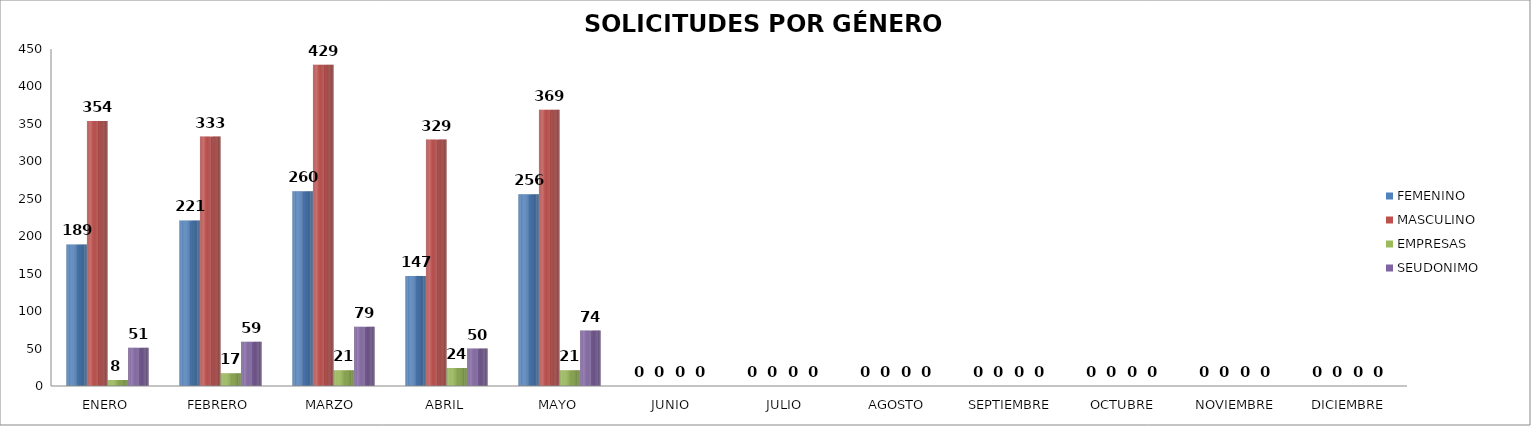
| Category | FEMENINO | MASCULINO | EMPRESAS | SEUDONIMO |
|---|---|---|---|---|
| ENERO | 189 | 354 | 8 | 51 |
| FEBRERO | 221 | 333 | 17 | 59 |
| MARZO  | 260 | 429 | 21 | 79 |
| ABRIL | 147 | 329 | 24 | 50 |
| MAYO | 256 | 369 | 21 | 74 |
| JUNIO | 0 | 0 | 0 | 0 |
| JULIO | 0 | 0 | 0 | 0 |
| AGOSTO | 0 | 0 | 0 | 0 |
| SEPTIEMBRE | 0 | 0 | 0 | 0 |
| OCTUBRE | 0 | 0 | 0 | 0 |
| NOVIEMBRE | 0 | 0 | 0 | 0 |
| DICIEMBRE | 0 | 0 | 0 | 0 |